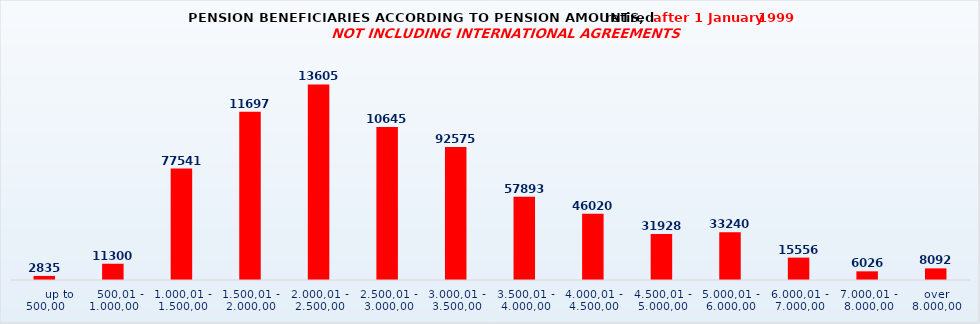
| Category | Series 0 |
|---|---|
|       up to 500,00 | 2835 |
|    500,01 - 1.000,00 | 11300 |
| 1.000,01 - 1.500,00 | 77541 |
| 1.500,01 - 2.000,00 | 116974 |
| 2.000,01 - 2.500,00 | 136055 |
| 2.500,01 - 3.000,00 | 106454 |
| 3.000,01 - 3.500,00 | 92575 |
| 3.500,01 - 4.000,00 | 57893 |
| 4.000,01 - 4.500,00 | 46020 |
| 4.500,01 - 5.000,00 | 31928 |
| 5.000,01 - 6.000,00 | 33240 |
| 6.000,01 - 7.000,00 | 15556 |
| 7.000,01 - 8.000,00 | 6026 |
| over 8.000,00 | 8092 |